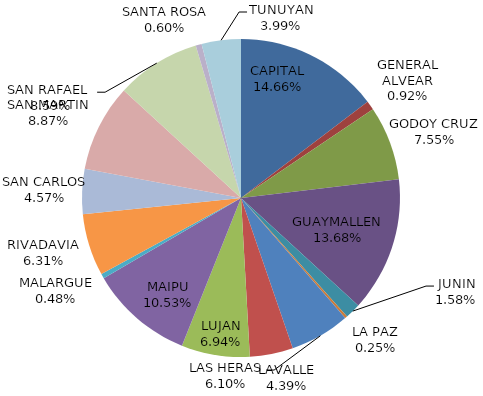
| Category | Total Otros Juegos Propios Recaudación  |
|---|---|
| CAPITAL | 586265 |
| GENERAL ALVEAR | 36695 |
| GODOY CRUZ | 302125 |
| GUAYMALLEN | 547045 |
| JUNIN | 63130 |
| LA PAZ | 9875 |
| LAS HERAS | 243945 |
| LAVALLE | 175610 |
| LUJAN | 277665 |
| MAIPU | 421070 |
| MALARGUE | 19140 |
| RIVADAVIA | 252590 |
| SAN CARLOS | 182680 |
| SAN MARTIN | 355015 |
| SAN RAFAEL  | 343580 |
| SANTA ROSA | 24190 |
| TUNUYAN | 159560 |